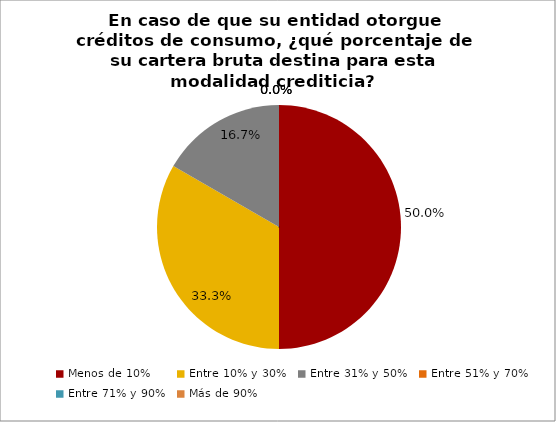
| Category | Series 0 |
|---|---|
| Menos de 10% | 0.5 |
| Entre 10% y 30% | 0.333 |
| Entre 31% y 50% | 0.167 |
| Entre 51% y 70% | 0 |
| Entre 71% y 90% | 0 |
| Más de 90% | 0 |